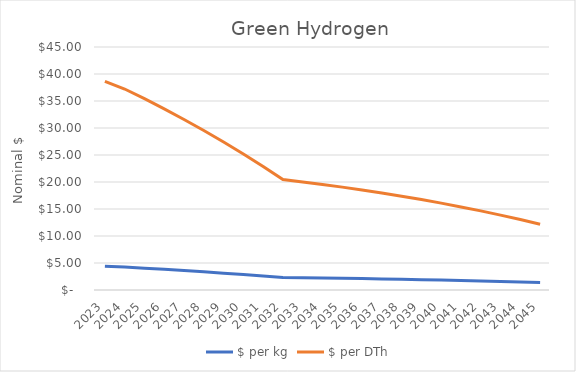
| Category | $ per kg | $ per DTh |
|---|---|---|
| 2023.0 | 4.401 | 38.644 |
| 2024.0 | 4.239 | 37.222 |
| 2025.0 | 4.035 | 35.425 |
| 2026.0 | 3.82 | 33.539 |
| 2027.0 | 3.597 | 31.579 |
| 2028.0 | 3.364 | 29.539 |
| 2029.0 | 3.122 | 27.414 |
| 2030.0 | 2.87 | 25.202 |
| 2031.0 | 2.606 | 22.884 |
| 2032.0 | 2.328 | 20.442 |
| 2033.0 | 2.279 | 20.007 |
| 2034.0 | 2.226 | 19.543 |
| 2035.0 | 2.17 | 19.049 |
| 2036.0 | 2.11 | 18.523 |
| 2037.0 | 2.046 | 17.965 |
| 2038.0 | 1.979 | 17.374 |
| 2039.0 | 1.907 | 16.748 |
| 2040.0 | 1.832 | 16.086 |
| 2041.0 | 1.752 | 15.387 |
| 2042.0 | 1.668 | 14.649 |
| 2043.0 | 1.58 | 13.871 |
| 2044.0 | 1.487 | 13.052 |
| 2045.0 | 1.388 | 12.19 |